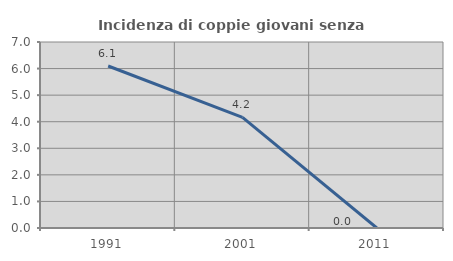
| Category | Incidenza di coppie giovani senza figli |
|---|---|
| 1991.0 | 6.098 |
| 2001.0 | 4.167 |
| 2011.0 | 0 |